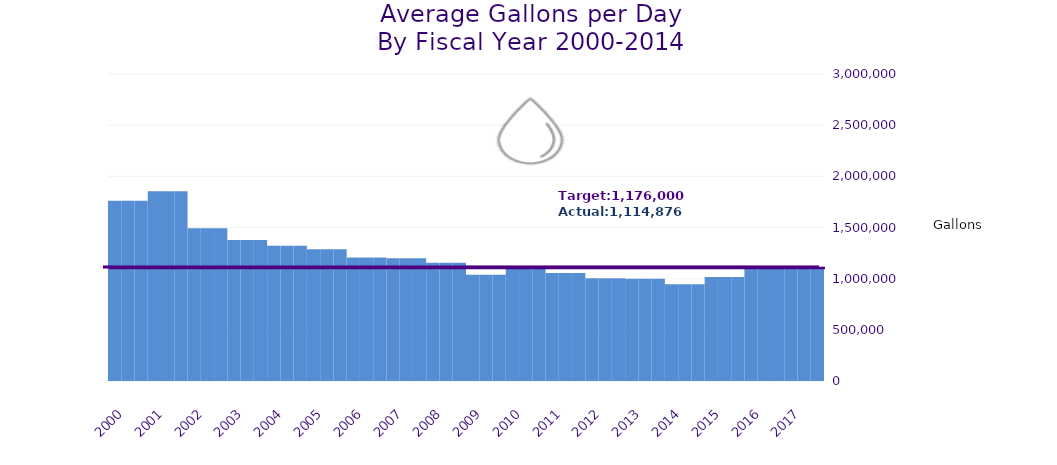
| Category | Average Daily Water Consumption in Gallons |
|---|---|
| 2000.0 | 1761762.862 |
| 2001.0 | 1855040 |
| 2002.0 | 1492537.368 |
| 2003.0 | 1376943.333 |
| 2004.0 | 1322090 |
| 2005.0 | 1287806.667 |
| 2006.0 | 1207721.116 |
| 2007.0 | 1199916.667 |
| 2008.0 | 1154924.433 |
| 2009.0 | 1037226.667 |
| 2010.0 | 1117854.607 |
| 2011.0 | 1055363.656 |
| 2012.0 | 1003353.497 |
| 2013.0 | 999183.226 |
| 2014.0 | 944925.796 |
| 2015.0 | 1016467.756 |
| 2016.0 | 1114876.459 |
| 2017.0 | 1100102.903 |